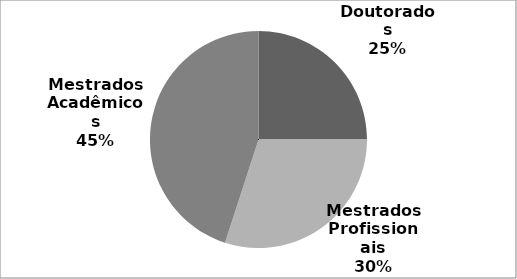
| Category | Series 0 |
|---|---|
| Doutorados | 0.25 |
| Mestrados Profissionais | 0.3 |
| Mestrados Acadêmicos | 0.45 |